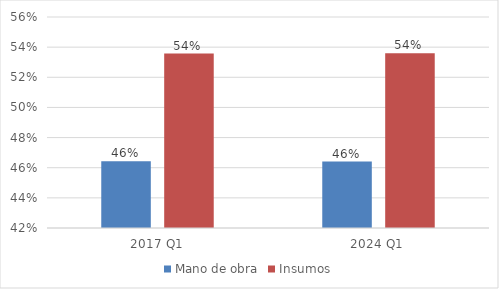
| Category | Mano de obra | Insumos |
|---|---|---|
| 2017 Q1 | 0.464 | 0.536 |
| 2024 Q1 | 0.464 | 0.536 |